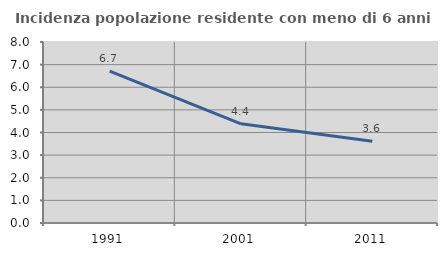
| Category | Incidenza popolazione residente con meno di 6 anni |
|---|---|
| 1991.0 | 6.716 |
| 2001.0 | 4.382 |
| 2011.0 | 3.617 |